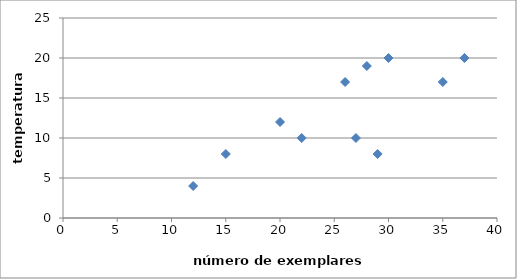
| Category | Series 0 |
|---|---|
| 37.0 | 20 |
| 35.0 | 17 |
| 27.0 | 10 |
| 15.0 | 8 |
| 29.0 | 8 |
| 12.0 | 4 |
| 28.0 | 19 |
| 30.0 | 20 |
| 26.0 | 17 |
| 20.0 | 12 |
| 22.0 | 10 |